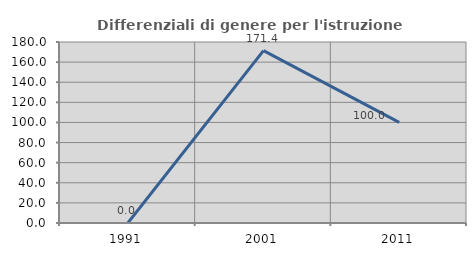
| Category | Differenziali di genere per l'istruzione superiore |
|---|---|
| 1991.0 | 0 |
| 2001.0 | 171.429 |
| 2011.0 | 100 |